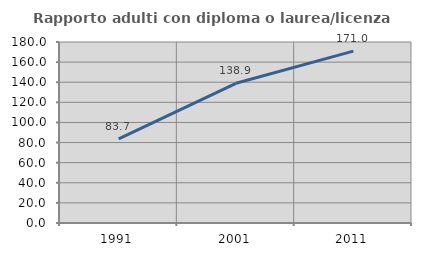
| Category | Rapporto adulti con diploma o laurea/licenza media  |
|---|---|
| 1991.0 | 83.673 |
| 2001.0 | 138.942 |
| 2011.0 | 170.968 |